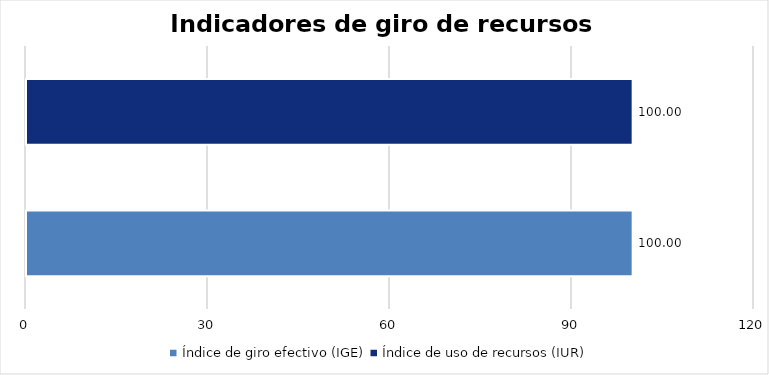
| Category | Series 0 |
|---|---|
| Índice de giro efectivo (IGE) | 100 |
| Índice de uso de recursos (IUR)  | 100 |